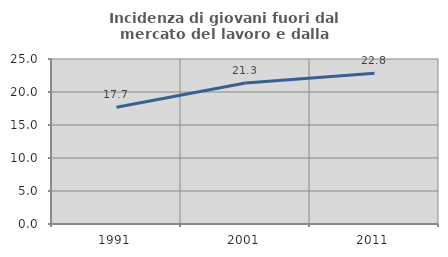
| Category | Incidenza di giovani fuori dal mercato del lavoro e dalla formazione  |
|---|---|
| 1991.0 | 17.7 |
| 2001.0 | 21.35 |
| 2011.0 | 22.845 |